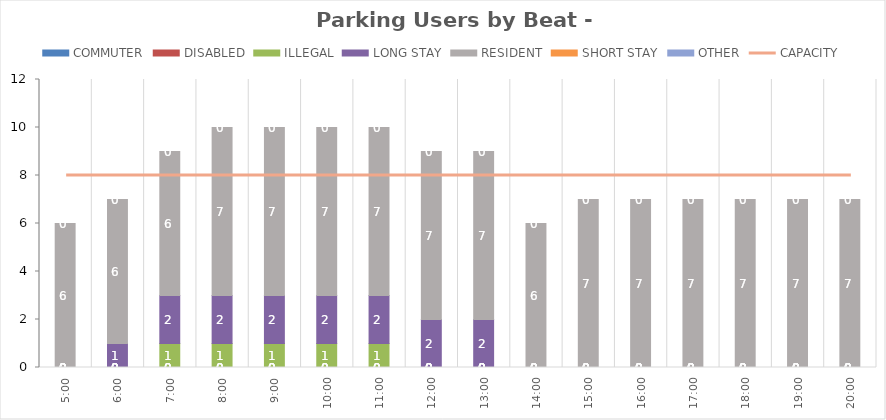
| Category | COMMUTER | DISABLED | ILLEGAL | LONG STAY | RESIDENT | SHORT STAY | OTHER |
|---|---|---|---|---|---|---|---|
| 0.20833333333333334 | 0 | 0 | 0 | 0 | 6 | 0 | 0 |
| 0.25 | 0 | 0 | 0 | 1 | 6 | 0 | 0 |
| 0.2916666666666667 | 0 | 0 | 1 | 2 | 6 | 0 | 0 |
| 0.3333333333333333 | 0 | 0 | 1 | 2 | 7 | 0 | 0 |
| 0.375 | 0 | 0 | 1 | 2 | 7 | 0 | 0 |
| 0.4166666666666667 | 0 | 0 | 1 | 2 | 7 | 0 | 0 |
| 0.4583333333333333 | 0 | 0 | 1 | 2 | 7 | 0 | 0 |
| 0.5 | 0 | 0 | 0 | 2 | 7 | 0 | 0 |
| 0.5416666666666666 | 0 | 0 | 0 | 2 | 7 | 0 | 0 |
| 0.5833333333333334 | 0 | 0 | 0 | 0 | 6 | 0 | 0 |
| 0.625 | 0 | 0 | 0 | 0 | 7 | 0 | 0 |
| 0.6666666666666666 | 0 | 0 | 0 | 0 | 7 | 0 | 0 |
| 0.7083333333333334 | 0 | 0 | 0 | 0 | 7 | 0 | 0 |
| 0.75 | 0 | 0 | 0 | 0 | 7 | 0 | 0 |
| 0.7916666666666666 | 0 | 0 | 0 | 0 | 7 | 0 | 0 |
| 0.8333333333333334 | 0 | 0 | 0 | 0 | 7 | 0 | 0 |